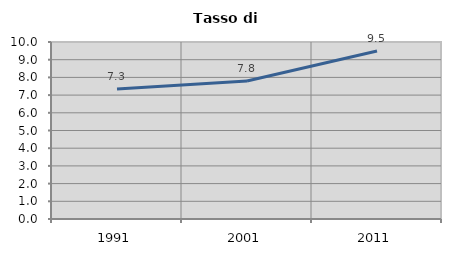
| Category | Tasso di disoccupazione   |
|---|---|
| 1991.0 | 7.345 |
| 2001.0 | 7.792 |
| 2011.0 | 9.494 |